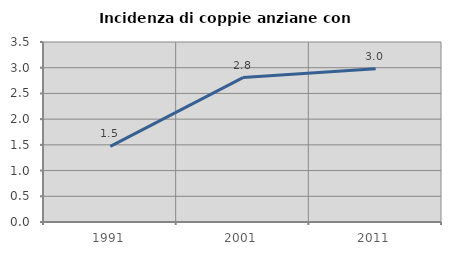
| Category | Incidenza di coppie anziane con figli |
|---|---|
| 1991.0 | 1.469 |
| 2001.0 | 2.809 |
| 2011.0 | 2.978 |